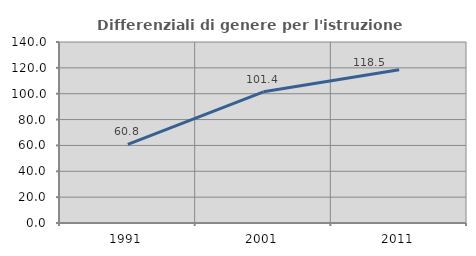
| Category | Differenziali di genere per l'istruzione superiore |
|---|---|
| 1991.0 | 60.754 |
| 2001.0 | 101.449 |
| 2011.0 | 118.499 |